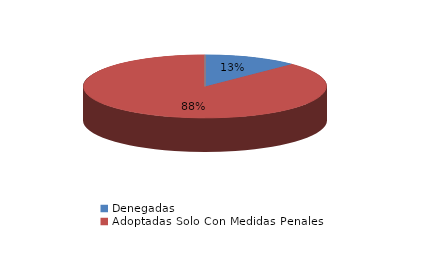
| Category | Series 0 |
|---|---|
| Denegadas | 2 |
| Adoptadas Solo Con Medidas Penales | 14 |
| Adoptadas Con Medidas Civiles Y Penales | 0 |
| Adoptadas Con Medidas Solo Civiles | 0 |